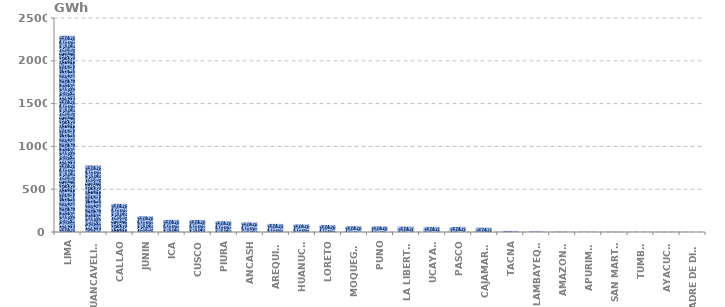
| Category | Series 0 |
|---|---|
| LIMA | 2291.792 |
| HUANCAVELICA | 776.862 |
| CALLAO | 328.67 |
| JUNIN | 183.043 |
| ICA | 141.509 |
| CUSCO | 139.896 |
| PIURA | 125.513 |
| ANCASH | 111.291 |
| AREQUIPA | 94.594 |
| HUANUCO | 88.596 |
| LORETO | 80.893 |
| MOQUEGUA | 67.78 |
| PUNO | 65.233 |
| LA LIBERTAD | 62.395 |
| UCAYALI | 59.857 |
| PASCO | 59.311 |
| CAJAMARCA | 50.54 |
| TACNA | 12.669 |
| LAMBAYEQUE | 6.324 |
| AMAZONAS | 3.808 |
| APURIMAC | 2.682 |
| SAN MARTÍN | 2.258 |
| TUMBES | 1.129 |
| AYACUCHO | 0.868 |
| MADRE DE DIOS | 0.251 |